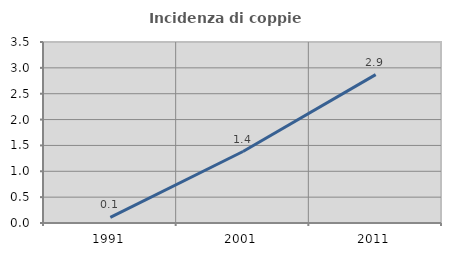
| Category | Incidenza di coppie miste |
|---|---|
| 1991.0 | 0.11 |
| 2001.0 | 1.382 |
| 2011.0 | 2.87 |